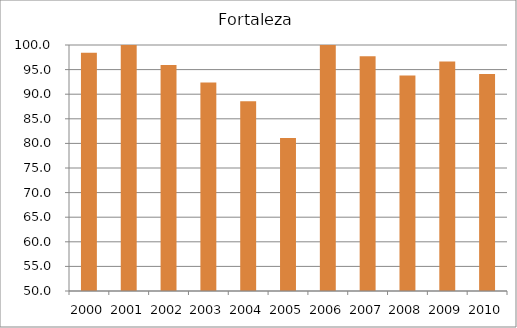
| Category | Fortaleza |
|---|---|
| 2000.0 | 98.4 |
| 2001.0 | 105.87 |
| 2002.0 | 95.92 |
| 2003.0 | 92.38 |
| 2004.0 | 88.57 |
| 2005.0 | 81.12 |
| 2006.0 | 104.81 |
| 2007.0 | 97.69 |
| 2008.0 | 93.8 |
| 2009.0 | 96.64 |
| 2010.0 | 94.11 |